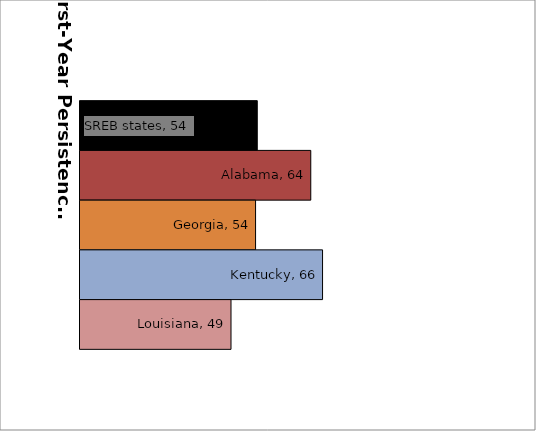
| Category | SREB states | Alabama | Georgia | Kentucky | Louisiana |
|---|---|---|---|---|---|
| 0 | 53.846 | 64.062 | 53.521 | 66.312 | 48.832 |